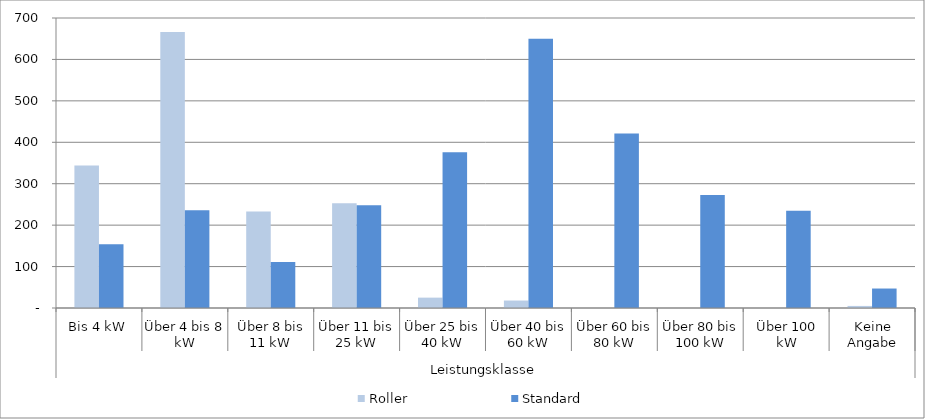
| Category | Roller | Standard |
|---|---|---|
| 0 | 344 | 154 |
| 1 | 666 | 236 |
| 2 | 233 | 111 |
| 3 | 253 | 248 |
| 4 | 25 | 376 |
| 5 | 18 | 650 |
| 6 | 0 | 421 |
| 7 | 0 | 273 |
| 8 | 0 | 235 |
| 9 | 5 | 47 |